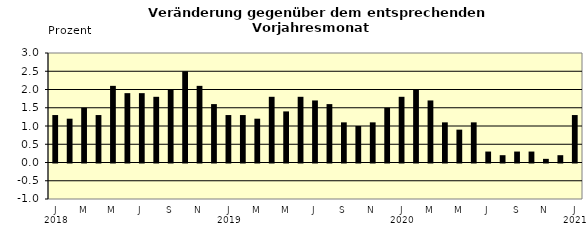
| Category | Series 0 |
|---|---|
| 0 | 1.3 |
| 1 | 1.2 |
| 2 | 1.5 |
| 3 | 1.3 |
| 4 | 2.1 |
| 5 | 1.9 |
| 6 | 1.9 |
| 7 | 1.8 |
| 8 | 2 |
| 9 | 2.5 |
| 10 | 2.1 |
| 11 | 1.6 |
| 12 | 1.3 |
| 13 | 1.3 |
| 14 | 1.2 |
| 15 | 1.8 |
| 16 | 1.4 |
| 17 | 1.8 |
| 18 | 1.7 |
| 19 | 1.6 |
| 20 | 1.1 |
| 21 | 1 |
| 22 | 1.1 |
| 23 | 1.5 |
| 24 | 1.8 |
| 25 | 2 |
| 26 | 1.7 |
| 27 | 1.1 |
| 28 | 0.9 |
| 29 | 1.1 |
| 30 | 0.3 |
| 31 | 0.2 |
| 32 | 0.3 |
| 33 | 0.3 |
| 34 | 0.1 |
| 35 | 0.2 |
| 36 | 1.3 |